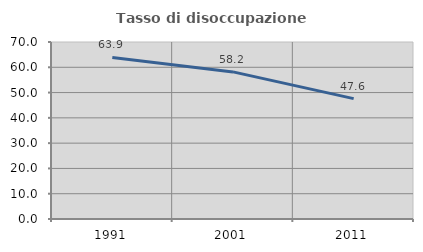
| Category | Tasso di disoccupazione giovanile  |
|---|---|
| 1991.0 | 63.898 |
| 2001.0 | 58.175 |
| 2011.0 | 47.619 |